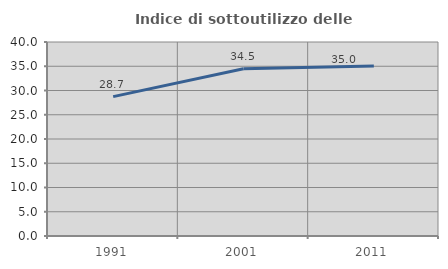
| Category | Indice di sottoutilizzo delle abitazioni  |
|---|---|
| 1991.0 | 28.737 |
| 2001.0 | 34.49 |
| 2011.0 | 35.042 |